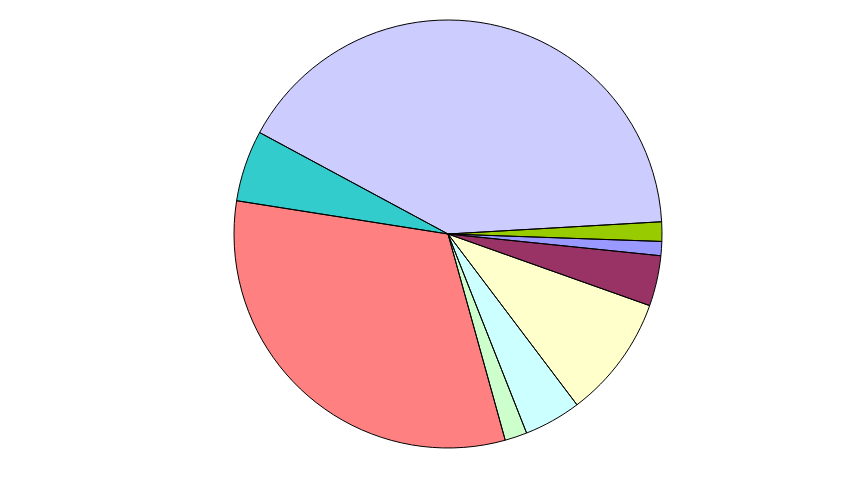
| Category | Series 0 | Series 1 | Series 2 | Series 3 | Series 4 | Series 5 | Series 6 | Series 7 | Series 8 |
|---|---|---|---|---|---|---|---|---|---|
| 0 | 0.011 |  |  |  |  |  |  |  |  |
| 1 | 0.038 |  |  |  |  |  |  |  |  |
| 2 | 0.093 |  |  |  |  |  |  |  |  |
| 3 | 0.043 |  |  |  |  |  |  |  |  |
| 4 | 0.017 |  |  |  |  |  |  |  |  |
| 5 | 0.318 |  |  |  |  |  |  |  |  |
| 6 | 0.054 |  |  |  |  |  |  |  |  |
| 7 | 0.412 |  |  |  |  |  |  |  |  |
| 8 | 0.015 |  |  |  |  |  |  |  |  |